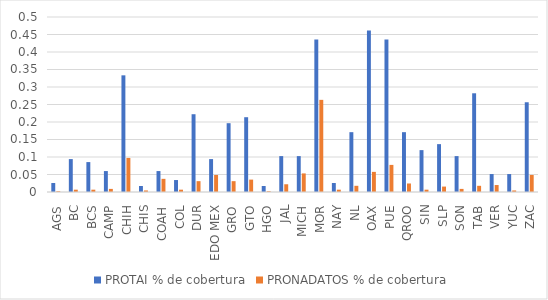
| Category | PROTAI % de cobertura | PRONADATOS % de cobertura |
|---|---|---|
| AGS | 0.026 | 0.002 |
| BC | 0.094 | 0.007 |
| BCS | 0.085 | 0.007 |
| CAMP | 0.06 | 0.009 |
| CHIH | 0.333 | 0.097 |
| CHIS | 0.017 | 0.004 |
| COAH | 0.06 | 0.038 |
| COL | 0.034 | 0.007 |
| DUR | 0.222 | 0.031 |
| EDO MEX | 0.094 | 0.049 |
| GRO | 0.197 | 0.031 |
| GTO | 0.214 | 0.035 |
| HGO | 0.017 | 0.002 |
| JAL | 0.103 | 0.022 |
| MICH | 0.103 | 0.053 |
| MOR | 0.436 | 0.263 |
| NAY | 0.026 | 0.007 |
| NL | 0.171 | 0.018 |
| OAX | 0.462 | 0.058 |
| PUE | 0.436 | 0.077 |
| QROO | 0.171 | 0.024 |
| SIN | 0.12 | 0.007 |
| SLP | 0.137 | 0.015 |
| SON | 0.103 | 0.009 |
| TAB | 0.282 | 0.018 |
| VER | 0.051 | 0.02 |
| YUC | 0.051 | 0.004 |
| ZAC | 0.256 | 0.049 |